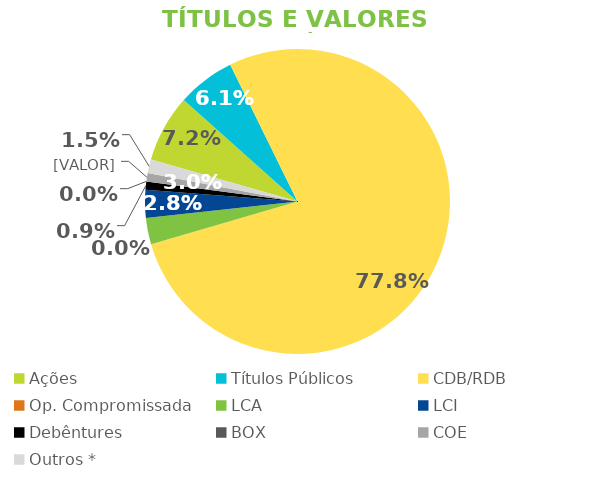
| Category | TVM |
|---|---|
| Ações | 0.072 |
| Títulos Públicos | 0.061 |
| CDB/RDB | 0.778 |
| Op. Compromissada | 0 |
| LCA | 0.028 |
| LCI | 0.03 |
| Debêntures | 0.009 |
| BOX | 0 |
| COE | 0.009 |
| Outros * | 0.015 |